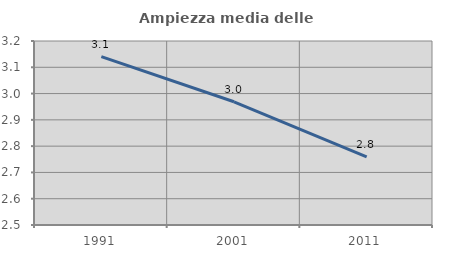
| Category | Ampiezza media delle famiglie |
|---|---|
| 1991.0 | 3.14 |
| 2001.0 | 2.969 |
| 2011.0 | 2.759 |